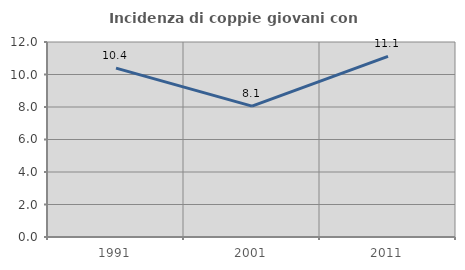
| Category | Incidenza di coppie giovani con figli |
|---|---|
| 1991.0 | 10.39 |
| 2001.0 | 8.051 |
| 2011.0 | 11.111 |